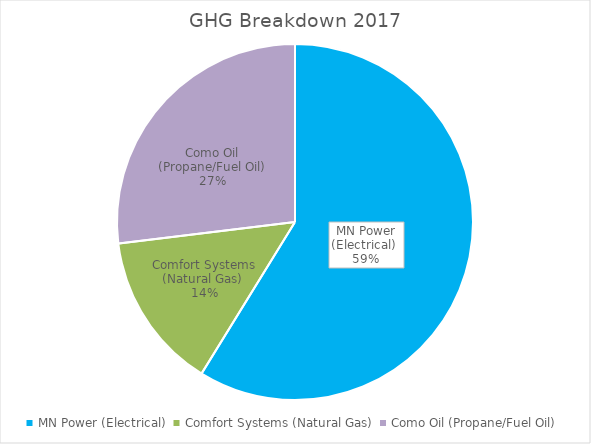
| Category | MN Power (Electrical)  |
|---|---|
| MN Power (Electrical)  | 716.609 |
| Comfort Systems (Natural Gas)  | 174.026 |
| Como Oil (Propane/Fuel Oil) | 328.265 |